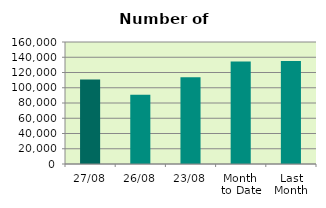
| Category | Series 0 |
|---|---|
| 27/08 | 110974 |
| 26/08 | 90834 |
| 23/08 | 113668 |
| Month 
to Date | 134433.789 |
| Last
Month | 134976 |